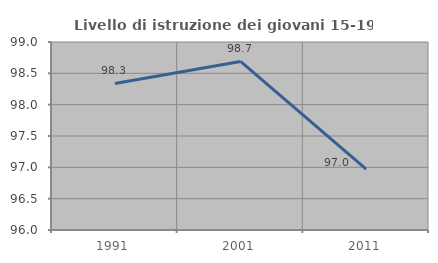
| Category | Livello di istruzione dei giovani 15-19 anni |
|---|---|
| 1991.0 | 98.339 |
| 2001.0 | 98.69 |
| 2011.0 | 96.97 |